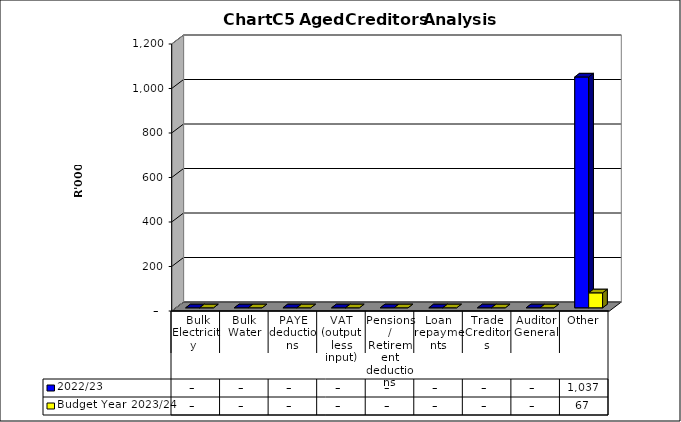
| Category | 2022/23 | Budget Year 2023/24 |
|---|---|---|
|  Bulk Electricity  | 0 | 0 |
| Bulk Water | 0 | 0 |
| PAYE deductions | 0 | 0 |
| VAT (output less input) | 0 | 0 |
| Pensions / Retirement deductions | 0 | 0 |
| Loan repayments | 0 | 0 |
| Trade Creditors | 0 | 0 |
| Auditor General | 0 | 0 |
| Other | 1037447 | 67217 |